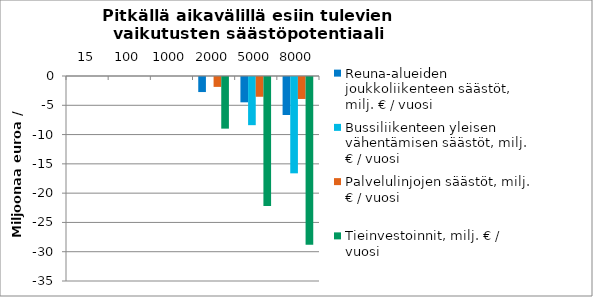
| Category | Reuna-alueiden joukkoliikenteen säästöt, milj. € / vuosi | Bussiliikenteen yleisen vähentämisen säästöt, milj. € / vuosi | Palvelulinjojen säästöt, milj. € / vuosi | Tieinvestoinnit, milj. € / vuosi |
|---|---|---|---|---|
| 15.0 | 0 | 0 | 0 | 0 |
| 100.0 | 0 | 0 | 0 | 0 |
| 1000.0 | 0 | 0 | 0 | 0 |
| 2000.0 | -2.57 | 0 | -1.688 | -8.815 |
| 5000.0 | -4.323 | -8.224 | -3.375 | -22.038 |
| 8000.0 | -6.485 | -16.447 | -3.75 | -28.65 |